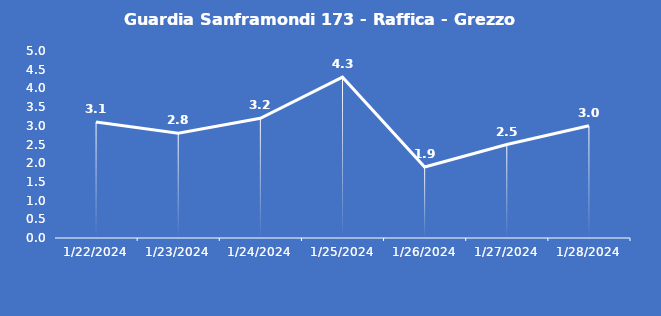
| Category | Guardia Sanframondi 173 - Raffica - Grezzo (m/s) |
|---|---|
| 1/22/24 | 3.1 |
| 1/23/24 | 2.8 |
| 1/24/24 | 3.2 |
| 1/25/24 | 4.3 |
| 1/26/24 | 1.9 |
| 1/27/24 | 2.5 |
| 1/28/24 | 3 |